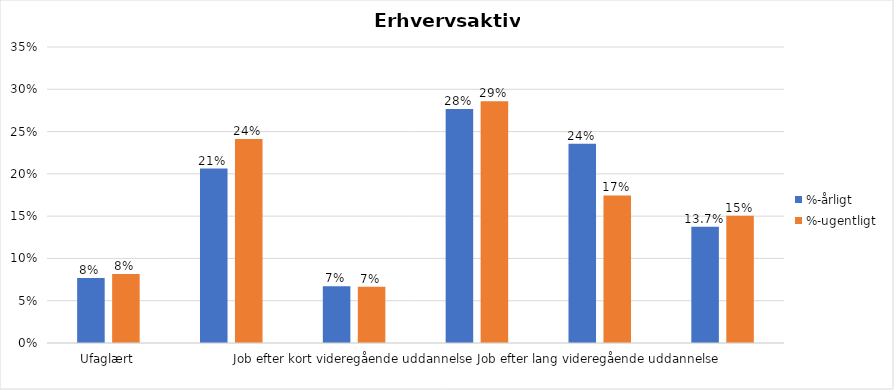
| Category | %-årligt | %-ugentligt |
|---|---|---|
| Ufaglært | 0.077 | 0.082 |
| Erhvervsfagligt job | 0.206 | 0.241 |
| Job efter kort videregående uddannelse | 0.067 | 0.067 |
| Job efter mellemlang videregående uddannelse | 0.277 | 0.286 |
| Job efter lang videregående uddannelse | 0.236 | 0.175 |
| Selvstændig | 0.137 | 0.15 |